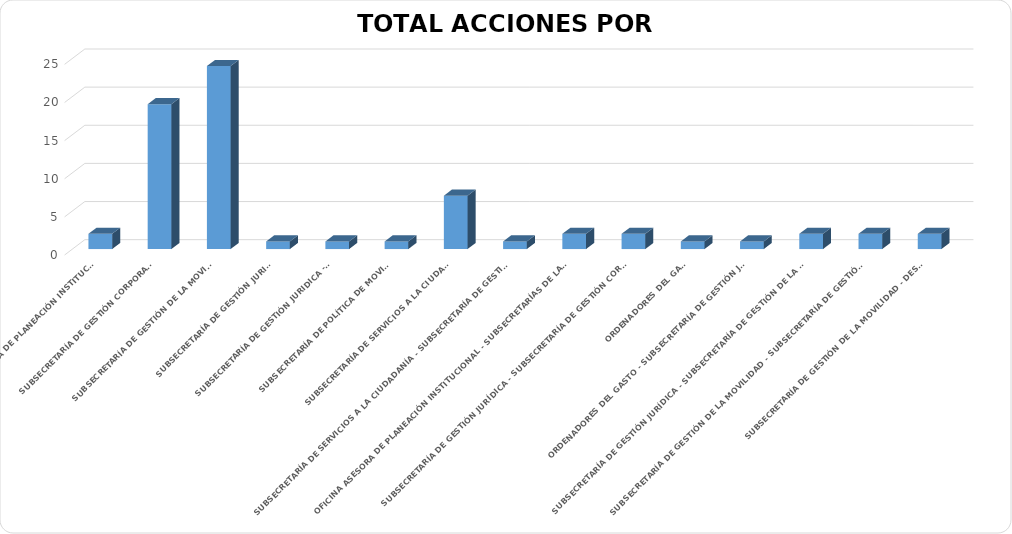
| Category | ABIERTA |
|---|---|
| OFICINA ASESORA DE PLANEACIÓN INSTITUCIONAL | 2 |
| SUBSECRETARÍA DE GESTIÓN CORPORATIVA  | 19 |
| SUBSECRETARÍA DE GESTIÓN DE LA MOVILIDAD | 24 |
| SUBSECRETARÍA DE GESTIÓN JURIDICA | 1 |
| SUBSECRETARÍA DE GESTIÓN JURIDICA - OTIC | 1 |
| SUBSECRETARÍA DE POLÍTICA DE MOVILIDAD | 1 |
| SUBSECRETARÍA DE SERVICIOS A LA CIUDADANÍA | 7 |
| SUBSECRETARÍA DE SERVICIOS A LA CIUDADANÍA - SUBSECRETARÍA DE GESTIÓN CORPORATIVA  | 1 |
| OFICINA ASESORA DE PLANEACIÓN INSTITUCIONAL - SUBSECRETARÍAS DE LA ENTIDAD. | 2 |
| SUBSECRETARÍA DE GESTIÓN JURÍDICA - SUBSECRETARÍA DE GESTIÓN CORPORATIVA | 2 |
| ORDENADORES DEL GASTO | 1 |
| ORDENADORES DEL GASTO - SUBSECRETARÍA DE GESTIÓN JURIDICA | 1 |
| SUBSECRETARÍA DE GESTIÓN JURÍDICA - SUBSECRETARÍA DE GESTIÓN DE LA MOVILIDAD | 2 |
| SUBSECRETARÍA DE GESTIÓN DE LA MOVILIDAD - SUBSECRETARÍA DE GESTIÓN CORPORATIVA  | 2 |
| SUBSECRETARÍA DE GESTIÓN DE LA MOVILIDAD - DESPACHO | 2 |